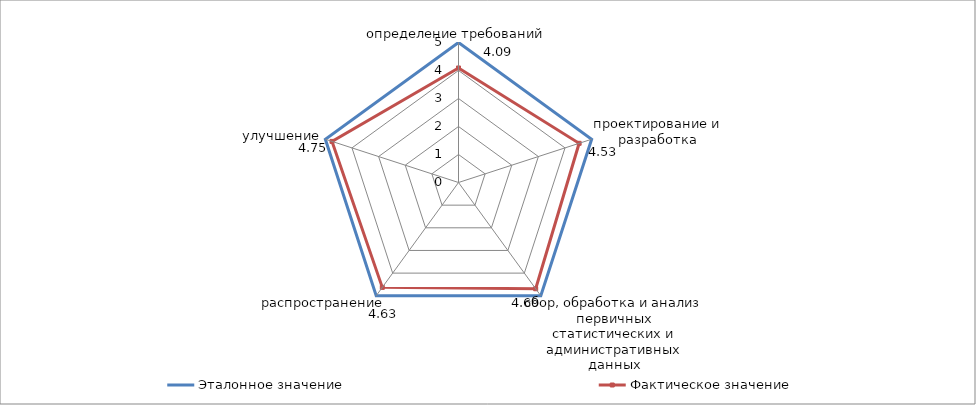
| Category | Эталонное значение | Фактическое значение |
|---|---|---|
| определение требований | 5 | 4.09 |
| проектирование и разработка | 5 | 4.53 |
| сбор, обработка и анализ первичных статистических и административных данных | 5 | 4.69 |
| распространение | 5 | 4.63 |
| улучшение | 5 | 4.75 |